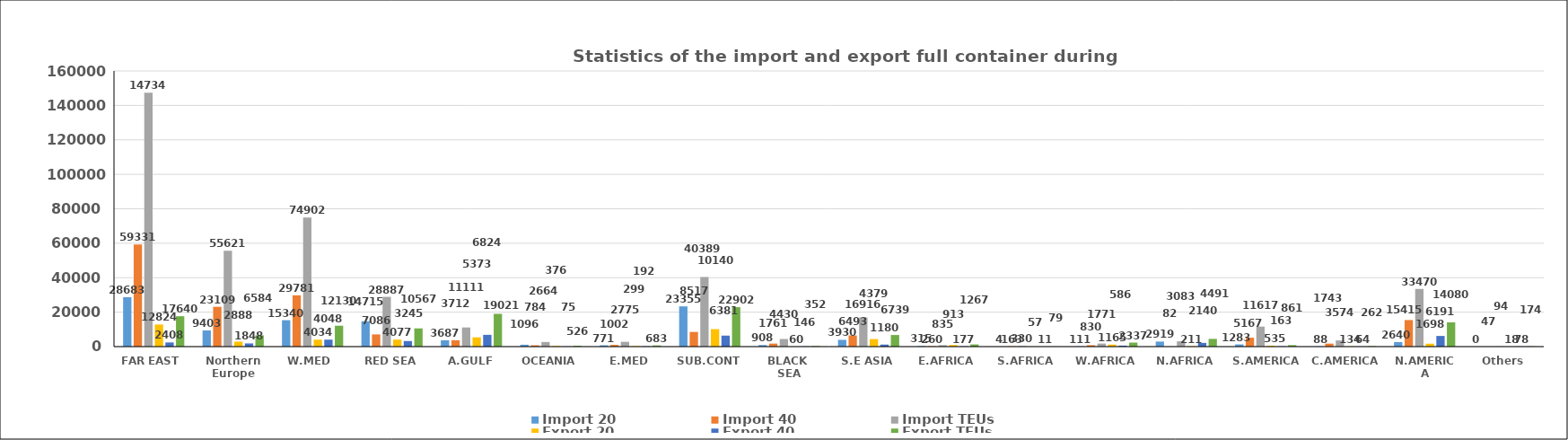
| Category | Import 20 | Import 40 | Import TEUs | Export 20 | Export 40 | Export TEUs |
|---|---|---|---|---|---|---|
| FAR EAST  | 28683 | 59331 | 147345 | 12824 | 2408 | 17640 |
| Northern Europe | 9403 | 23109 | 55621 | 2888 | 1848 | 6584 |
| W.MED  | 15340 | 29781 | 74902 | 4034 | 4048 | 12130 |
| RED SEA | 14715 | 7086 | 28887 | 4077 | 3245 | 10567 |
| A.GULF | 3687 | 3712 | 11111 | 5373 | 6824 | 19021 |
| OCEANIA | 1096 | 784 | 2664 | 376 | 75 | 526 |
| E.MED | 771 | 1002 | 2775 | 299 | 192 | 683 |
| SUB.CONT | 23355 | 8517 | 40389 | 10140 | 6381 | 22902 |
| BLACK  SEA | 908 | 1761 | 4430 | 60 | 146 | 352 |
| S.E ASIA | 3930 | 6493 | 16916 | 4379 | 1180 | 6739 |
| E.AFRICA | 315 | 260 | 835 | 913 | 177 | 1267 |
| S.AFRICA | 4 | 163 | 330 | 57 | 11 | 79 |
| W.AFRICA | 111 | 830 | 1771 | 1165 | 586 | 2337 |
| N.AFRICA | 2919 | 82 | 3083 | 211 | 2140 | 4491 |
| S.AMERICA | 1283 | 5167 | 11617 | 535 | 163 | 861 |
| C.AMERICA | 88 | 1743 | 3574 | 134 | 64 | 262 |
| N.AMERICA | 2640 | 15415 | 33470 | 1698 | 6191 | 14080 |
| Others | 0 | 47 | 94 | 18 | 78 | 174 |